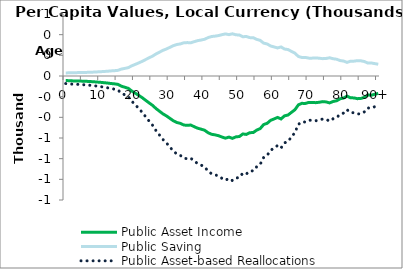
| Category | Public Asset Income | Public Saving | Public Asset-based Reallocations |
|---|---|---|---|
| 0 | -43.718 | 29.6 | -73.318 |
|  | -45.5 | 30.806 | -76.305 |
| 2 | -47.281 | 32.012 | -79.293 |
| 3 | -48.066 | 32.543 | -80.61 |
| 4 | -48.59 | 32.898 | -81.487 |
| 5 | -50.432 | 34.145 | -84.576 |
| 6 | -51.54 | 34.896 | -86.436 |
| 7 | -53.644 | 36.32 | -89.965 |
| 8 | -55.566 | 37.622 | -93.188 |
| 9 | -58.546 | 39.639 | -98.185 |
| 10 | -61.235 | 41.46 | -102.695 |
| 11 | -64.647 | 43.769 | -108.416 |
| 12 | -67.976 | 46.023 | -113.999 |
| 13 | -72.632 | 49.176 | -121.808 |
| 14 | -75.809 | 51.327 | -127.136 |
| 15 | -80.555 | 54.54 | -135.095 |
| 16 | -98.312 | 66.563 | -164.875 |
| 17 | -108.587 | 73.52 | -182.107 |
| 18 | -119.162 | 80.679 | -199.841 |
| 19 | -144.972 | 98.154 | -243.127 |
| 20 | -165.665 | 112.164 | -277.83 |
| 21 | -186.622 | 126.353 | -312.975 |
| 22 | -209.229 | 141.66 | -350.889 |
| 23 | -234.702 | 158.906 | -393.608 |
| 24 | -260.016 | 176.045 | -436.061 |
| 25 | -284.002 | 192.285 | -476.287 |
| 26 | -315.121 | 213.354 | -528.475 |
| 27 | -340.908 | 230.813 | -571.721 |
| 28 | -366.717 | 248.288 | -615.005 |
| 29 | -386.234 | 261.502 | -647.736 |
| 30 | -409.85 | 277.491 | -687.34 |
| 31 | -433.707 | 293.643 | -727.35 |
| 32 | -450.074 | 304.725 | -754.799 |
| 33 | -458.206 | 310.231 | -768.437 |
| 34 | -474.231 | 321.08 | -795.311 |
| 35 | -477.588 | 323.353 | -800.94 |
| 36 | -474.448 | 321.227 | -795.676 |
| 37 | -490.745 | 332.261 | -823.006 |
| 38 | -505.488 | 342.243 | -847.73 |
| 39 | -514.424 | 348.293 | -862.717 |
| 40 | -525.158 | 355.561 | -880.718 |
| 41 | -549.048 | 371.735 | -920.783 |
| 42 | -564.169 | 381.973 | -946.142 |
| 43 | -569.683 | 385.707 | -955.39 |
| 44 | -577.765 | 391.179 | -968.944 |
| 45 | -590.715 | 399.946 | -990.661 |
| 46 | -601.564 | 407.292 | -1008.856 |
| 47 | -591.342 | 400.371 | -991.712 |
| 48 | -603.323 | 408.483 | -1011.806 |
| 49 | -589.056 | 398.823 | -987.879 |
| 50 | -585.658 | 396.523 | -982.181 |
| 51 | -560.664 | 379.6 | -940.265 |
| 52 | -565.399 | 382.806 | -948.205 |
| 53 | -548.593 | 371.427 | -920.02 |
| 54 | -547.235 | 370.508 | -917.744 |
| 55 | -523.539 | 354.465 | -878.004 |
| 56 | -509.079 | 344.675 | -853.754 |
| 57 | -469.754 | 318.049 | -787.803 |
| 58 | -457.989 | 310.083 | -768.072 |
| 59 | -429.066 | 290.501 | -719.567 |
| 60 | -415.477 | 281.301 | -696.778 |
| 61 | -400.955 | 271.468 | -672.423 |
| 62 | -415.46 | 281.289 | -696.75 |
| 63 | -385.777 | 261.192 | -646.969 |
| 64 | -377.777 | 255.776 | -633.553 |
| 65 | -351.985 | 238.313 | -590.298 |
| 66 | -326.383 | 220.979 | -547.361 |
| 67 | -279.137 | 188.991 | -468.127 |
| 68 | -264.645 | 179.179 | -443.825 |
| 69 | -265.67 | 179.873 | -445.543 |
| 70 | -255.422 | 172.935 | -428.357 |
| 71 | -255.452 | 172.955 | -428.407 |
| 72 | -258.064 | 174.724 | -432.788 |
| 73 | -254.193 | 172.103 | -426.296 |
| 74 | -247.969 | 167.889 | -415.858 |
| 75 | -251.003 | 169.942 | -420.945 |
| 76 | -260.366 | 176.282 | -436.648 |
| 77 | -246.565 | 166.938 | -413.504 |
| 78 | -240.086 | 162.551 | -402.637 |
| 79 | -220.736 | 149.45 | -370.187 |
| 80 | -214.028 | 144.909 | -358.937 |
| 81 | -194.616 | 131.765 | -326.381 |
| 82 | -211.057 | 142.897 | -353.954 |
| 83 | -211.937 | 143.493 | -355.43 |
| 84 | -219.372 | 148.527 | -367.899 |
| 85 | -217.221 | 147.07 | -364.292 |
| 86 | -206.938 | 140.108 | -347.046 |
| 87 | -184.402 | 124.85 | -309.251 |
| 88 | -185.832 | 125.818 | -311.65 |
| 89 | -177.038 | 119.864 | -296.902 |
| 90+ | -168.282 | 113.936 | -282.218 |